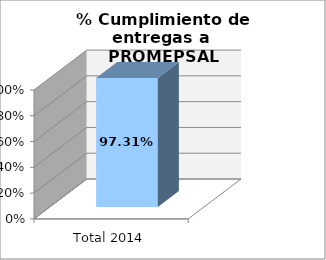
| Category | % |
|---|---|
| Total 2014 | 0.973 |